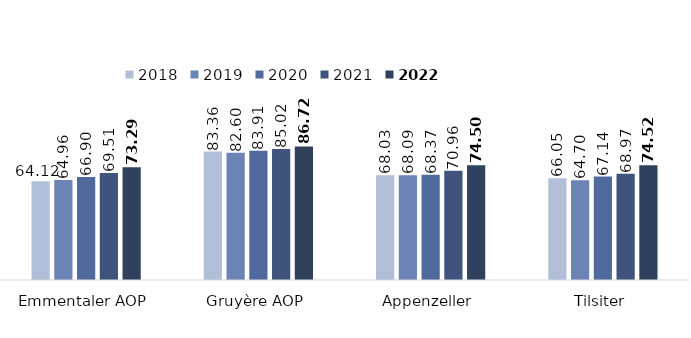
| Category | 2018 | 2019 | 2020 | 2021 | 2022 |
|---|---|---|---|---|---|
| Emmentaler AOP | 64.121 | 64.958 | 66.901 | 69.506 | 73.287 |
| Gruyère AOP | 83.362 | 82.598 | 83.914 | 85.021 | 86.723 |
| Appenzeller | 68.034 | 68.087 | 68.368 | 70.959 | 74.503 |
| Tilsiter | 66.053 | 64.698 | 67.143 | 68.975 | 74.517 |